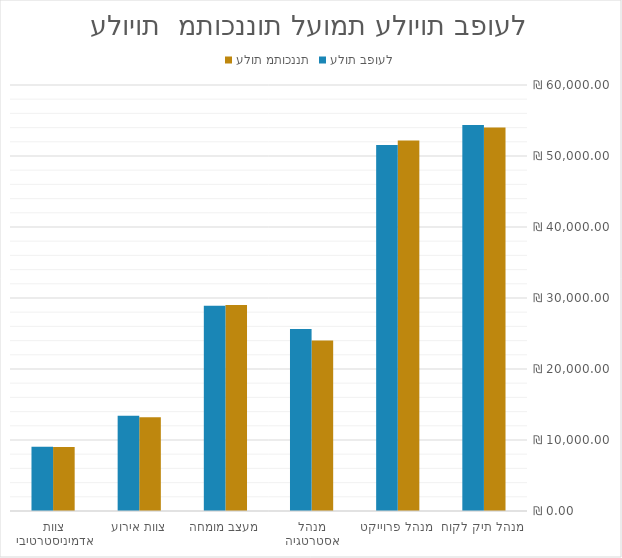
| Category | עלות מתוכננת | עלות בפועל |
|---|---|---|
| מנהל תיק לקוח | 54000 | 54360 |
| מנהל פרוייקט | 52200 | 51540 |
| מנהל אסטרטגיה | 24000 | 25650 |
| מעצב מומחה | 29000 | 28900 |
| צוות אירוע | 13200 | 13400 |
| צוות אדמיניסטרטיבי | 9000 | 9060 |